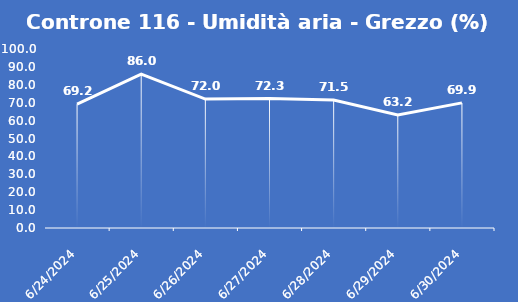
| Category | Controne 116 - Umidità aria - Grezzo (%) |
|---|---|
| 6/24/24 | 69.2 |
| 6/25/24 | 86 |
| 6/26/24 | 72 |
| 6/27/24 | 72.3 |
| 6/28/24 | 71.5 |
| 6/29/24 | 63.2 |
| 6/30/24 | 69.9 |